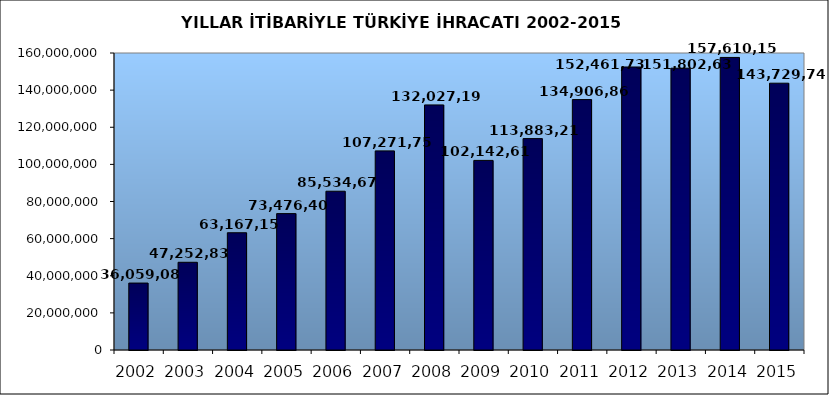
| Category | 2002 | 2015 |
|---|---|---|
| 2002.0 | 36059089.029 |  |
| 2003.0 | 47252836.302 |  |
| 2004.0 | 63167152.82 |  |
| 2005.0 | 73476408.143 |  |
| 2006.0 | 85534675.518 |  |
| 2007.0 | 107271749.904 |  |
| 2008.0 | 132027195.626 |  |
| 2009.0 | 102142612.603 |  |
| 2010.0 | 113883219.184 |  |
| 2011.0 | 134906868.83 |  |
| 2012.0 | 152461736.556 |  |
| 2013.0 | 151802637.087 |  |
| 2014.0 | 157610157.69 |  |
| 2015.0 | 143729741.023 |  |